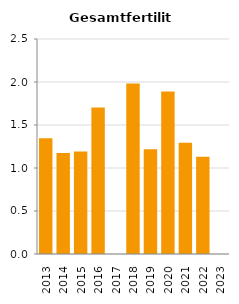
| Category | Gesamtfertilität |
|---|---|
| 2013.0 | 1.347 |
| 2014.0 | 1.175 |
| 2015.0 | 1.193 |
| 2016.0 | 1.703 |
| 2017.0 | 0 |
| 2018.0 | 1.983 |
| 2019.0 | 1.219 |
| 2020.0 | 1.89 |
| 2021.0 | 1.295 |
| 2022.0 | 1.13 |
| 2023.0 | 0 |